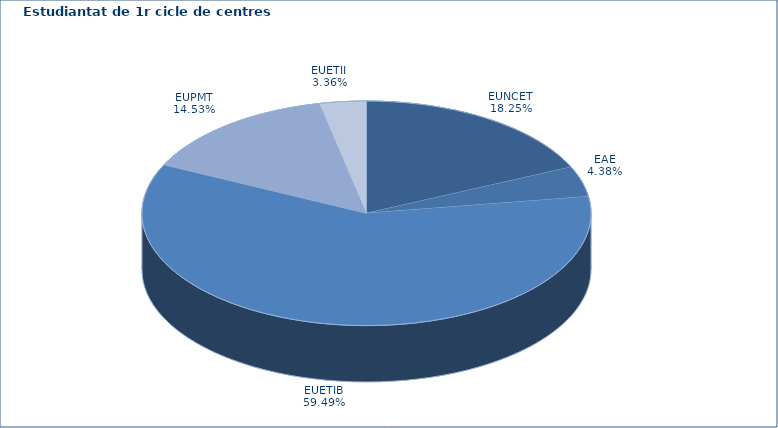
| Category | Series 0 |
|---|---|
| EUNCET | 250 |
| EAE | 60 |
| EUETIB | 815 |
| EUPMT | 199 |
| EUETII | 46 |